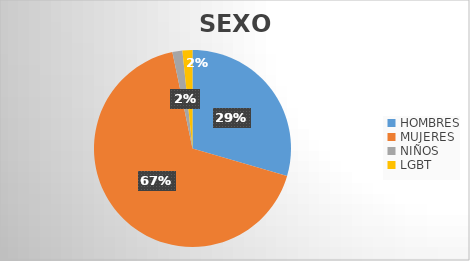
| Category | Series 0 |
|---|---|
| HOMBRES | 18 |
| MUJERES | 41 |
| NIÑOS | 1 |
| LGBT | 1 |